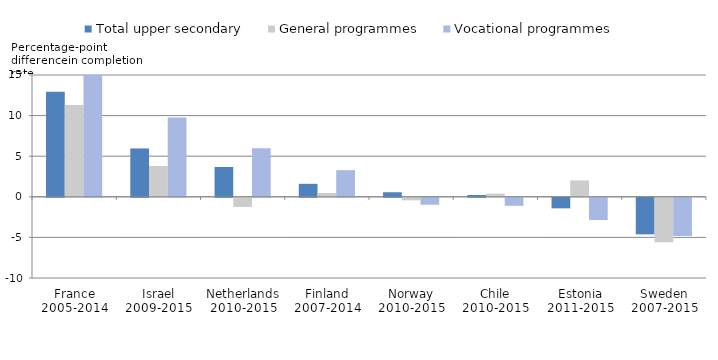
| Category | Total upper secondary | General programmes | Vocational programmes |
|---|---|---|---|
| France
2005-2014 | 12.931 | 11.298 | 15.185 |
| Israel
2009-2015 | 5.956 | 3.796 | 9.777 |
| Netherlands
2010-2015 | 3.672 | -1.122 | 5.978 |
| Finland
2007-2014 | 1.597 | 0.47 | 3.28 |
| Norway
2010-2015 | 0.56 | -0.314 | -0.854 |
| Chile
2010-2015 | 0.225 | 0.397 | -0.987 |
| Estonia
2011-2015 | -1.3 | 2.014 | -2.736 |
| Sweden
2007-2015 | -4.501 | -5.481 | -4.701 |